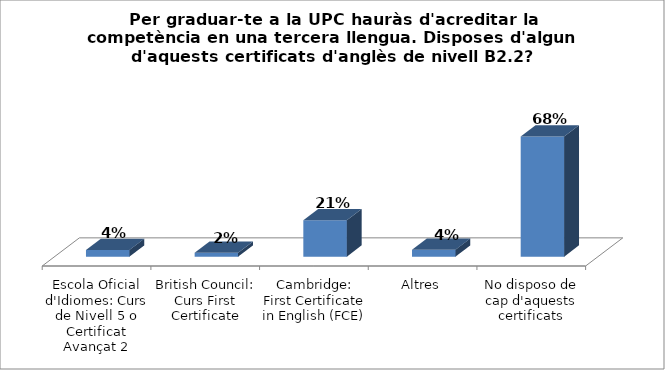
| Category | Series 0 |
|---|---|
| Escola Oficial d'Idiomes: Curs de Nivell 5 o Certificat Avançat 2 | 0.038 |
| British Council: Curs First Certificate | 0.022 |
| Cambridge: First Certificate in English (FCE) | 0.205 |
| Altres | 0.039 |
| No disposo de cap d'aquests certificats | 0.677 |